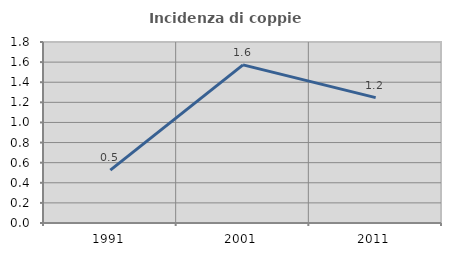
| Category | Incidenza di coppie miste |
|---|---|
| 1991.0 | 0.526 |
| 2001.0 | 1.573 |
| 2011.0 | 1.246 |